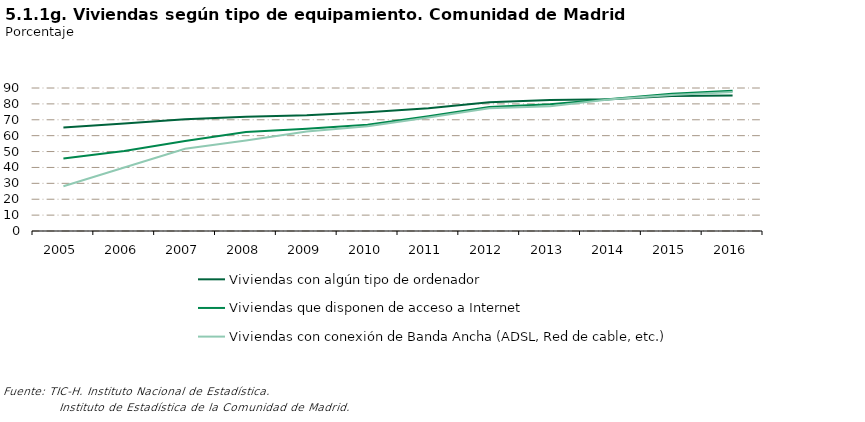
| Category | Viviendas con algún tipo de ordenador | Viviendas que disponen de acceso a Internet | Viviendas con conexión de Banda Ancha (ADSL, Red de cable, etc.) |
|---|---|---|---|
| 2005.0 | 65.142 | 45.66 | 28.12 |
| 2006.0 | 67.69 | 50.357 | 39.929 |
| 2007.0 | 70.359 | 56.617 | 51.737 |
| 2008.0 | 71.863 | 62.346 | 56.95 |
| 2009.0 | 72.841 | 64.335 | 62.642 |
| 2010.0 | 74.693 | 66.855 | 65.943 |
| 2011.0 | 77.33 | 72.244 | 71.423 |
| 2012.0 | 81.001 | 77.987 | 77.265 |
| 2013.0 | 82.509 | 79.822 | 78.451 |
| 2014.0 | 82.866 | 83.143 | 82.897 |
| 2015.0 | 84.91 | 86.371 | 85.653 |
| 2016.0 | 85.259 | 88.307 | 87.535 |